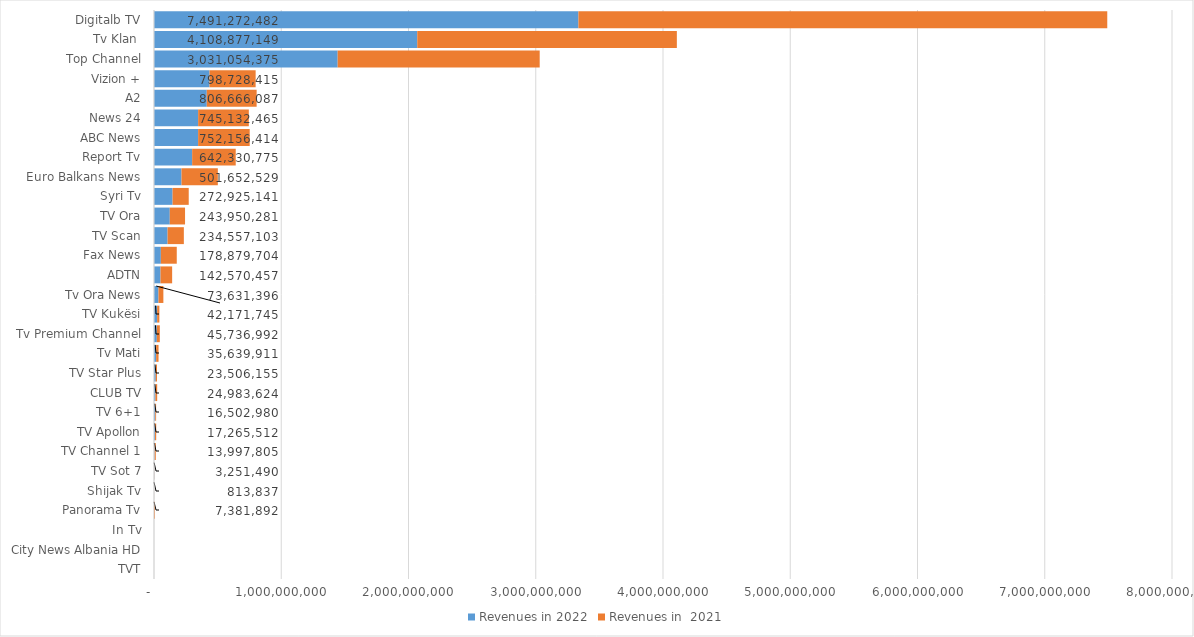
| Category | Revenues in 2022 | Revenues in  2021 |
|---|---|---|
| TVT | 0 | 0 |
| City News Albania HD | 0 | 0 |
| In Tv | 0 | 0 |
| Panorama Tv | 210242 | 7171650 |
| Shijak Tv | 347039 | 466798 |
| TV Sot 7 | 1869101 | 1382389 |
| TV Channel 1 | 4605285 | 9392520 |
| TV Apollon | 8025222 | 9240290 |
| TV 6+1 | 9904980 | 6598000 |
| CLUB TV | 11307650 | 13675974 |
| TV Star Plus | 13464616 | 10041539 |
| Tv Mati | 16898946 | 18740965 |
| Tv Premium Channel | 22152200 | 23584792 |
| TV Kukësi | 24814278 | 17357467 |
| Tv Ora News | 35062900 | 38568496 |
| ADTN | 51151078 | 91419379 |
| Fax News | 53924547 | 124955157 |
| TV Scan | 106662878 | 127894225 |
| TV Ora | 124075035 | 119875246 |
| Syri Tv | 145982192 | 126942949 |
| Euro Balkans News | 216141281 | 285511248 |
| Report Tv | 299795327 | 342535448 |
| ABC News | 346698061 | 405458353 |
| News 24 | 346906821 | 398225644 |
| A2 | 414768795 | 391897292 |
| Vizion + | 436336452 | 362391963 |
| Top Channel | 1443417716 | 1587636659 |
| Tv Klan  | 2068823675 | 2040053474 |
| Digitalb TV | 3335297685 | 4155974797 |